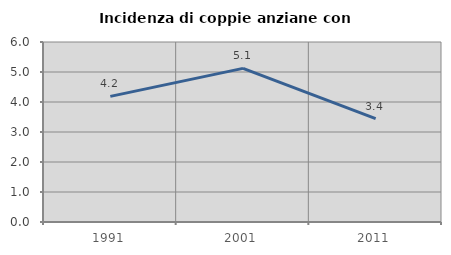
| Category | Incidenza di coppie anziane con figli |
|---|---|
| 1991.0 | 4.187 |
| 2001.0 | 5.12 |
| 2011.0 | 3.443 |